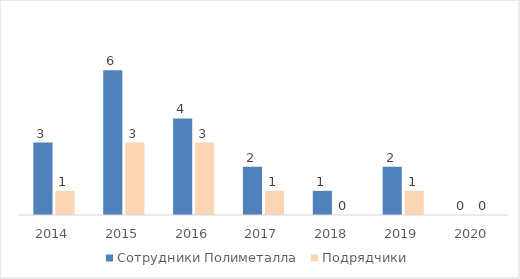
| Category | Сотрудники Полиметалла | Подрядчики |
|---|---|---|
| 2014.0 | 3 | 1 |
| 2015.0 | 6 | 3 |
| 2016.0 | 4 | 3 |
| 2017.0 | 2 | 1 |
| 2018.0 | 1 | 0 |
| 2019.0 | 2 | 1 |
| 2020.0 | 0 | 0 |